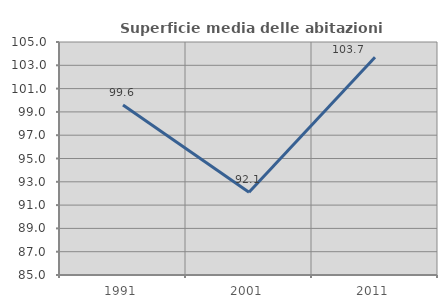
| Category | Superficie media delle abitazioni occupate |
|---|---|
| 1991.0 | 99.595 |
| 2001.0 | 92.109 |
| 2011.0 | 103.683 |